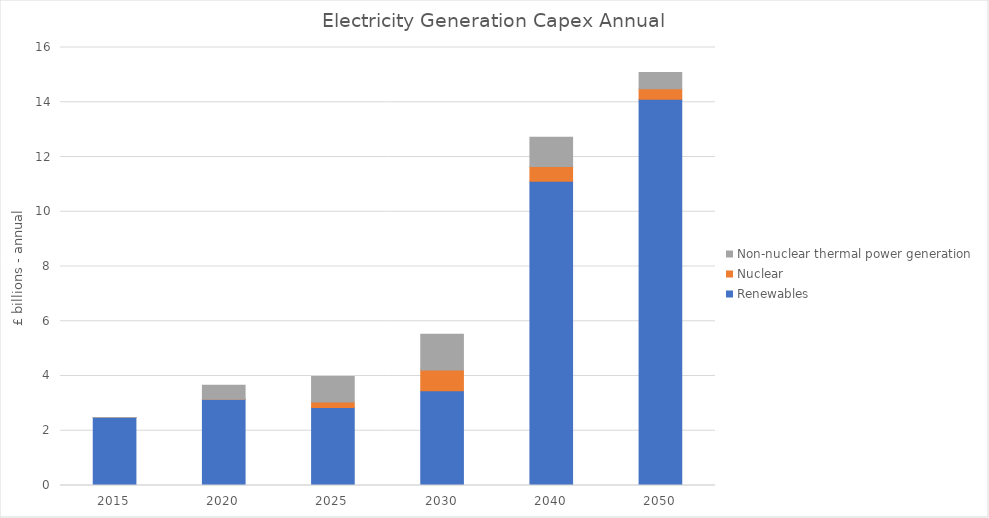
| Category | Renewables | Nuclear | Non-nuclear thermal power generation |
|---|---|---|---|
| 2015.0 | 2.482 | 0 | 0 |
| 2020.0 | 3.154 | 0 | 0.504 |
| 2025.0 | 2.85 | 0.201 | 0.933 |
| 2030.0 | 3.462 | 0.757 | 1.307 |
| 2040.0 | 11.118 | 0.537 | 1.067 |
| 2050.0 | 14.113 | 0.381 | 0.589 |